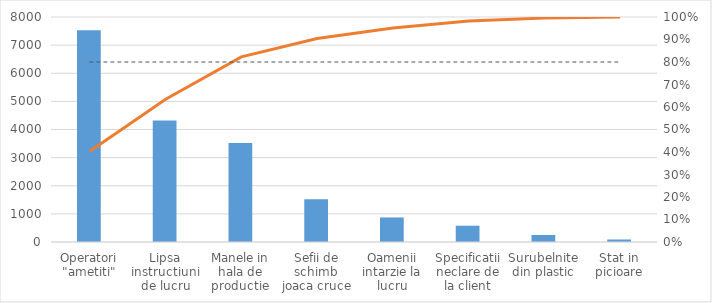
| Category | Frecventa |
|---|---|
| Operatori "ametiti" | 7528 |
| Lipsa instructiuni de lucru | 4321 |
| Manele in hala de productie | 3521 |
| Sefii de schimb joaca cruce | 1524 |
| Oamenii intarzie la lucru | 872 |
| Specificatii neclare de la client | 579 |
| Surubelnite din plastic | 250 |
| Stat in picioare | 89 |